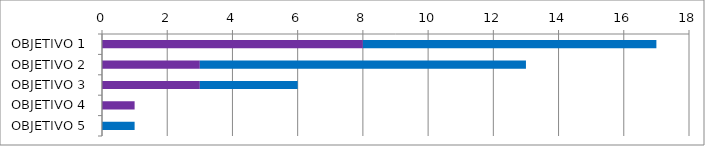
| Category | Series 0 | Series 3 | Series 1 |
|---|---|---|---|
| OBJETIVO 1 | 0 | 8 | 9 |
| OBJETIVO 2 | 0 | 3 | 10 |
| OBJETIVO 3 | 0 | 3 | 3 |
| OBJETIVO 4 | 0 | 1 | 0 |
| OBJETIVO 5 | 0 | 0 | 1 |